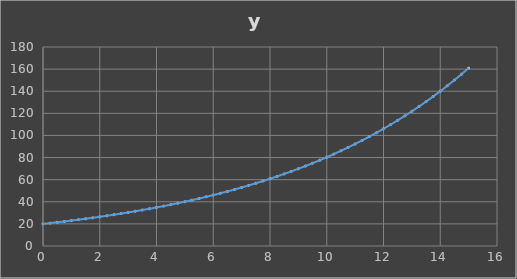
| Category | y |
|---|---|
| 0.0 | 20 |
| 0.25 | 20.707 |
| 0.5 | 21.439 |
| 0.75 | 22.198 |
| 1.0 | 22.982 |
| 1.25 | 23.795 |
| 1.5 | 24.637 |
| 1.75 | 25.508 |
| 2.0 | 26.41 |
| 2.25 | 27.344 |
| 2.5 | 28.31 |
| 2.75 | 29.312 |
| 3.0 | 30.348 |
| 3.25 | 31.421 |
| 3.5 | 32.532 |
| 3.75 | 33.683 |
| 4.0 | 34.874 |
| 4.25 | 36.107 |
| 4.5 | 37.384 |
| 4.75 | 38.706 |
| 5.0 | 40.074 |
| 5.25 | 41.491 |
| 5.5 | 42.958 |
| 5.75 | 44.477 |
| 6.0 | 46.05 |
| 6.25 | 47.679 |
| 6.5 | 49.365 |
| 6.75 | 51.11 |
| 7.0 | 52.917 |
| 7.25 | 54.789 |
| 7.5 | 56.726 |
| 7.75 | 58.732 |
| 8.0 | 60.809 |
| 8.25 | 62.959 |
| 8.5 | 65.185 |
| 8.75 | 67.49 |
| 9.0 | 69.877 |
| 9.25 | 72.348 |
| 9.5 | 74.906 |
| 9.75 | 77.555 |
| 10.0 | 80.297 |
| 10.25 | 83.136 |
| 10.5 | 86.076 |
| 10.75 | 89.12 |
| 11.0 | 92.271 |
| 11.25 | 95.534 |
| 11.5 | 98.912 |
| 11.75 | 102.41 |
| 12.0 | 106.031 |
| 12.25 | 109.78 |
| 12.5 | 113.662 |
| 12.75 | 117.682 |
| 13.0 | 121.843 |
| 13.25 | 126.151 |
| 13.5 | 130.612 |
| 13.75 | 135.231 |
| 14.0 | 140.013 |
| 14.25 | 144.964 |
| 14.5 | 150.09 |
| 14.75 | 155.397 |
| 15.0 | 160.892 |